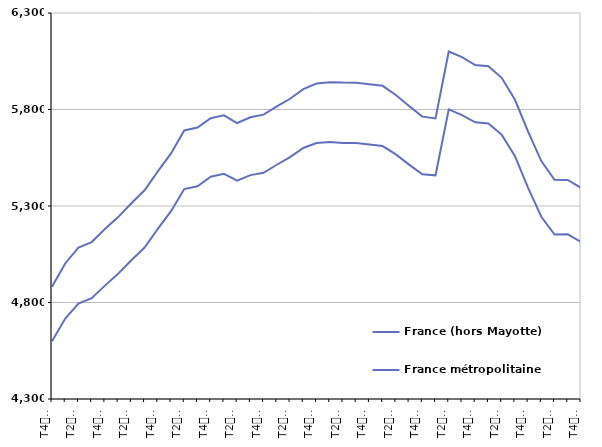
| Category | France (hors Mayotte) | France métropolitaine |
|---|---|---|
| T4
2012 | 4881.7 | 4599.7 |
| T1
2013 | 5002.3 | 4716.5 |
| T2
2013 | 5084.8 | 4794 |
| T3
2013 | 5113.2 | 4822.1 |
| T4
2013 | 5180.4 | 4887.5 |
| T1
2014 | 5242.6 | 4949.4 |
| T2
2014 | 5314 | 5018.7 |
| T3
2014 | 5381.5 | 5084.6 |
| T4
2014 | 5479.6 | 5181.7 |
| T1
2015 | 5572.6 | 5273.1 |
| T2
2015 | 5691.3 | 5387.7 |
| T3
2015 | 5706.6 | 5402.5 |
| T4
2015 | 5754.8 | 5451.4 |
| T1
2016 | 5769.9 | 5466.5 |
| T2
2016 | 5730 | 5430.8 |
| T3
2016 | 5760 | 5460.1 |
| T4
2016 | 5773.5 | 5472.1 |
| T1
2017 | 5816.2 | 5513.8 |
| T2
2017 | 5855.6 | 5553.2 |
| T3
2017 | 5905.6 | 5600.8 |
| T4
2017 | 5934.8 | 5626.4 |
| T1
2018 | 5941.8 | 5631.4 |
| T2
2018 | 5939.3 | 5626.8 |
| T3
2018 | 5939.2 | 5626.8 |
| T4
2018 | 5930.7 | 5619 |
| T1
2019 | 5922.7 | 5610.7 |
| T2
2019 | 5875.5 | 5567.6 |
| T3
2019 | 5818.5 | 5514.6 |
| T4
2019 | 5763.1 | 5464.7 |
| T1
2020 | 5753.9 | 5459 |
| T2
2020 | 6100.6 | 5800.5 |
| T3
2020 | 6071.8 | 5770.7 |
| T4
2020 | 6030.4 | 5733.6 |
| T1
2021 | 6024.7 | 5727.8 |
| T2
2021 | 5964.2 | 5669.7 |
| T3
2021 | 5851.5 | 5559.2 |
| T4
2021 | 5685.4 | 5394.2 |
| T1
2022 | 5532.7 | 5244.2 |
| T2
2022 | 5436.1 | 5152.1 |
| T3
2022 | 5435.1 | 5153 |
| T4
2022 | 5394.2 | 5113.4 |